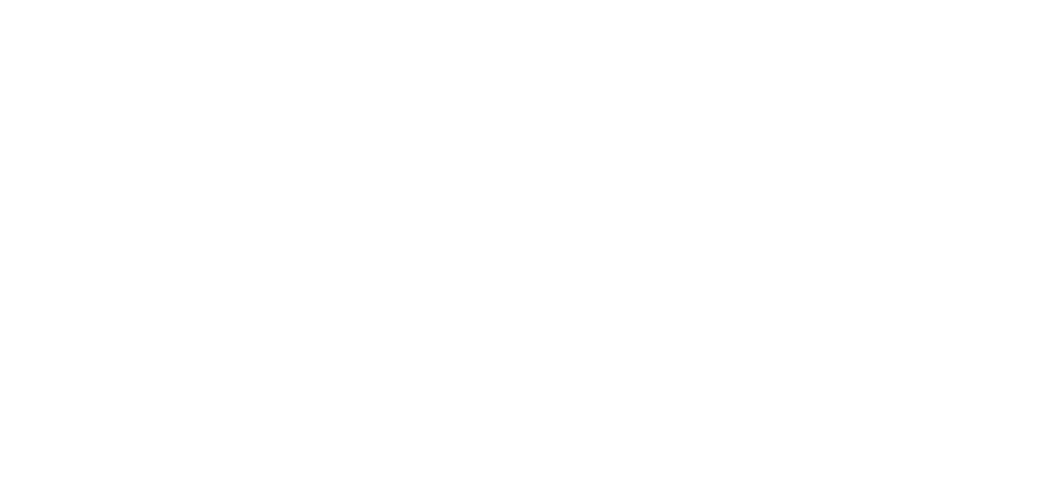
| Category | Total |
|---|---|
| Al Hodeidah | 579 |
| Hajjah | 484 |
| Marib | 213 |
| Taiz | 202 |
| Al Jawf | 171 |
| Amran | 148 |
| Hadramawt | 104 |
| Ad Dali | 96 |
| Lahj | 77 |
| Abyan | 65 |
| Ibb | 57 |
| Sanaa | 52 |
| Sadah | 46 |
| Aden | 41 |
| Al Bayda | 37 |
| Dhamar | 22 |
| Shabwah | 19 |
| Al Maharah | 12 |
| Raymah | 8 |
| Al Mahwit | 8 |
| Sanaa City | 4 |
| Socotra | 1 |